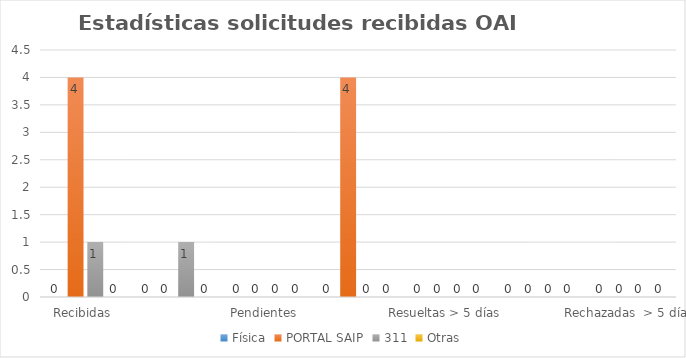
| Category | Física | PORTAL SAIP | 311 | Otras |
|---|---|---|---|---|
| Recibidas  | 0 | 4 | 1 | 0 |
| Cambiadas a otra institución | 0 | 0 | 1 | 0 |
| Pendientes  | 0 | 0 | 0 | 0 |
| Resueltas < 5 días | 0 | 4 | 0 | 0 |
| Resueltas > 5 días  | 0 | 0 | 0 | 0 |
| Rechazadas  < 5 días | 0 | 0 | 0 | 0 |
| Rechazadas  > 5 días | 0 | 0 | 0 | 0 |